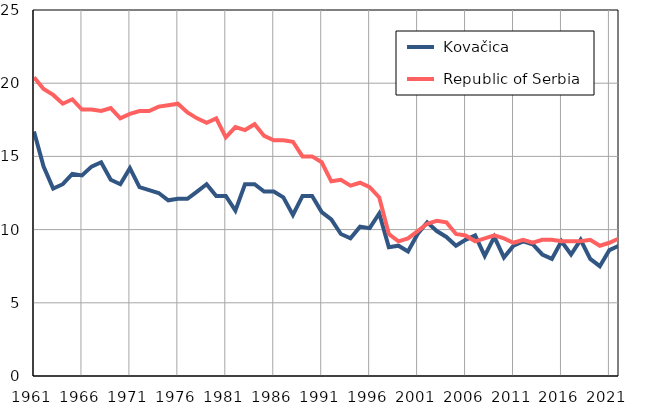
| Category |  Kovačica |  Republic of Serbia |
|---|---|---|
| 1961.0 | 16.7 | 20.4 |
| 1962.0 | 14.3 | 19.6 |
| 1963.0 | 12.8 | 19.2 |
| 1964.0 | 13.1 | 18.6 |
| 1965.0 | 13.8 | 18.9 |
| 1966.0 | 13.7 | 18.2 |
| 1967.0 | 14.3 | 18.2 |
| 1968.0 | 14.6 | 18.1 |
| 1969.0 | 13.4 | 18.3 |
| 1970.0 | 13.1 | 17.6 |
| 1971.0 | 14.2 | 17.9 |
| 1972.0 | 12.9 | 18.1 |
| 1973.0 | 12.7 | 18.1 |
| 1974.0 | 12.5 | 18.4 |
| 1975.0 | 12 | 18.5 |
| 1976.0 | 12.1 | 18.6 |
| 1977.0 | 12.1 | 18 |
| 1978.0 | 12.6 | 17.6 |
| 1979.0 | 13.1 | 17.3 |
| 1980.0 | 12.3 | 17.6 |
| 1981.0 | 12.3 | 16.3 |
| 1982.0 | 11.3 | 17 |
| 1983.0 | 13.1 | 16.8 |
| 1984.0 | 13.1 | 17.2 |
| 1985.0 | 12.6 | 16.4 |
| 1986.0 | 12.6 | 16.1 |
| 1987.0 | 12.2 | 16.1 |
| 1988.0 | 11 | 16 |
| 1989.0 | 12.3 | 15 |
| 1990.0 | 12.3 | 15 |
| 1991.0 | 11.2 | 14.6 |
| 1992.0 | 10.7 | 13.3 |
| 1993.0 | 9.7 | 13.4 |
| 1994.0 | 9.4 | 13 |
| 1995.0 | 10.2 | 13.2 |
| 1996.0 | 10.1 | 12.9 |
| 1997.0 | 11.1 | 12.2 |
| 1998.0 | 8.8 | 9.7 |
| 1999.0 | 8.9 | 9.2 |
| 2000.0 | 8.5 | 9.4 |
| 2001.0 | 9.7 | 9.9 |
| 2002.0 | 10.5 | 10.4 |
| 2003.0 | 9.9 | 10.6 |
| 2004.0 | 9.5 | 10.5 |
| 2005.0 | 8.9 | 9.7 |
| 2006.0 | 9.3 | 9.6 |
| 2007.0 | 9.6 | 9.2 |
| 2008.0 | 8.2 | 9.4 |
| 2009.0 | 9.5 | 9.6 |
| 2010.0 | 8.1 | 9.4 |
| 2011.0 | 8.9 | 9.1 |
| 2012.0 | 9.2 | 9.3 |
| 2013.0 | 9 | 9.1 |
| 2014.0 | 8.3 | 9.3 |
| 2015.0 | 8 | 9.3 |
| 2016.0 | 9.2 | 9.2 |
| 2017.0 | 8.3 | 9.2 |
| 2018.0 | 9.3 | 9.2 |
| 2019.0 | 8 | 9.3 |
| 2020.0 | 7.5 | 8.9 |
| 2021.0 | 8.6 | 9.1 |
| 2022.0 | 8.9 | 9.4 |